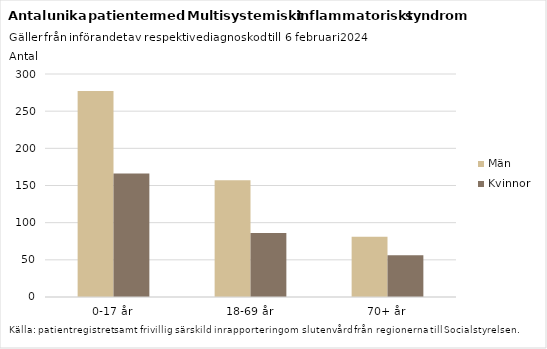
| Category | Män | Kvinnor |
|---|---|---|
| 0-17 år | 277 | 166 |
| 18-69 år | 157 | 86 |
| 70+ år | 81 | 56 |